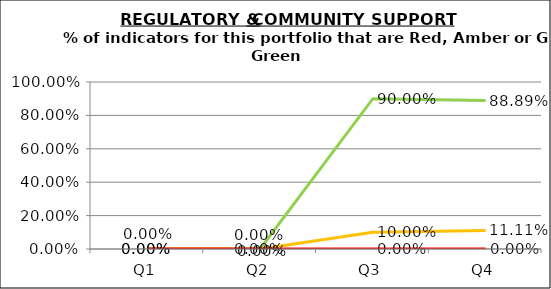
| Category | Green | Amber | Red |
|---|---|---|---|
| Q1 | 0 | 0 | 0 |
| Q2 | 0 | 0 | 0 |
| Q3 | 0.9 | 0.1 | 0 |
| Q4 | 0.889 | 0.111 | 0 |